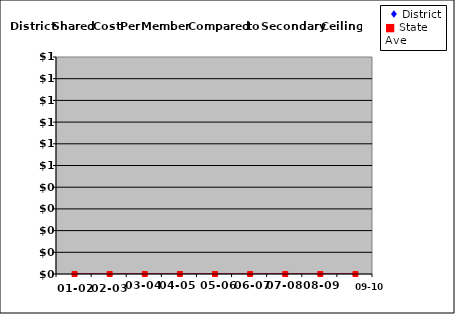
| Category | Series 0 | Series 1 |
|---|---|---|
| 0 | 0 | 0 |
| 1 | 0 | 0 |
| 2 | 0 | 0 |
| 3 | 0 | 0 |
| 4 | 0 | 0 |
| 5 | 0 | 0 |
| 6 | 0 | 0 |
| 7 | 0 | 0 |
| 8 | 0 | 0 |